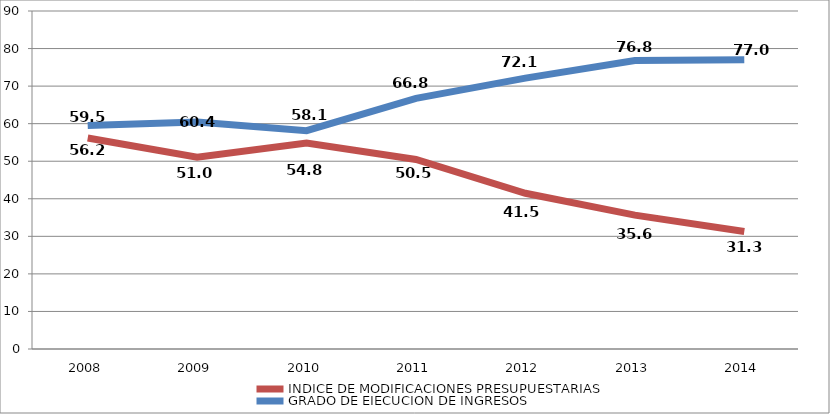
| Category | INDICE DE MODIFICACIONES PRESUPUESTARIAS | GRADO DE EJECUCION DE INGRESOS |
|---|---|---|
| 2008.0 | 56.172 | 59.53 |
| 2009.0 | 51.048 | 60.442 |
| 2010.0 | 54.831 | 58.131 |
| 2011.0 | 50.463 | 66.753 |
| 2012.0 | 41.475 | 72.112 |
| 2013.0 | 35.646 | 76.817 |
| 2014.0 | 31.308 | 76.996 |